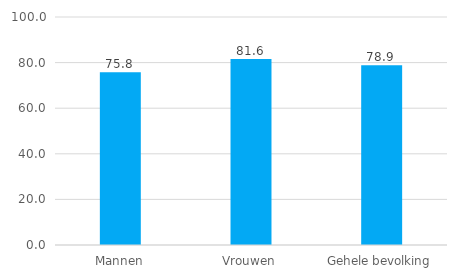
| Category | Curaçao |
|---|---|
| Mannen | 75.775 |
| Vrouwen | 81.63 |
| Gehele bevolking | 78.88 |